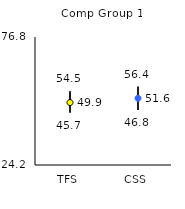
| Category | 25th | 75th | Mean |
|---|---|---|---|
| TFS | 45.7 | 54.5 | 49.86 |
| CSS | 46.8 | 56.4 | 51.62 |